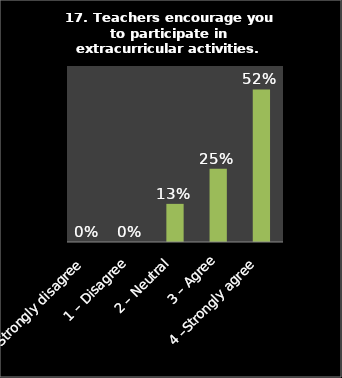
| Category | Series 0 |
|---|---|
| 0 – Strongly disagree | 0 |
| 1 – Disagree | 0 |
| 2 – Neutral | 0.13 |
| 3 – Agree | 0.25 |
| 4 –Strongly agree | 0.52 |